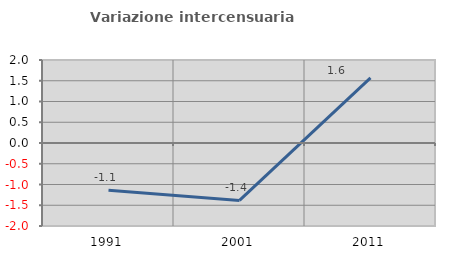
| Category | Variazione intercensuaria annua |
|---|---|
| 1991.0 | -1.14 |
| 2001.0 | -1.384 |
| 2011.0 | 1.57 |